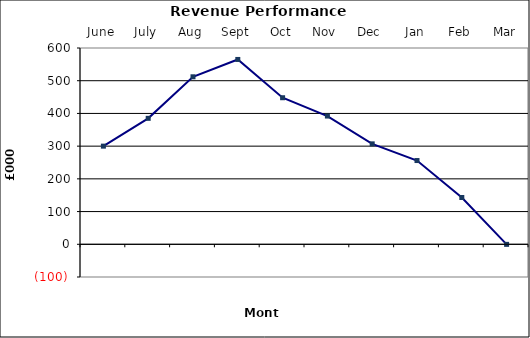
| Category | Series 0 |
|---|---|
| June | 300 |
| July | 385 |
| Aug | 512 |
| Sept | 565 |
| Oct | 448 |
| Nov | 392 |
| Dec | 307 |
| Jan | 256 |
| Feb | 143 |
| Mar | -0.23 |